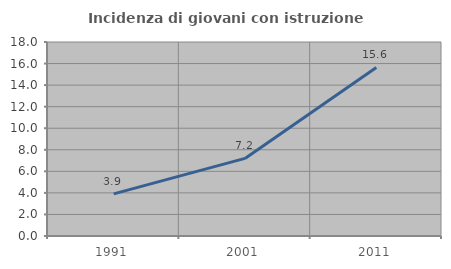
| Category | Incidenza di giovani con istruzione universitaria |
|---|---|
| 1991.0 | 3.909 |
| 2001.0 | 7.2 |
| 2011.0 | 15.64 |